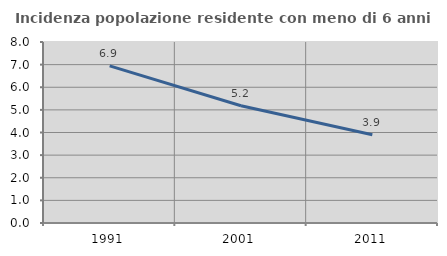
| Category | Incidenza popolazione residente con meno di 6 anni |
|---|---|
| 1991.0 | 6.947 |
| 2001.0 | 5.184 |
| 2011.0 | 3.897 |